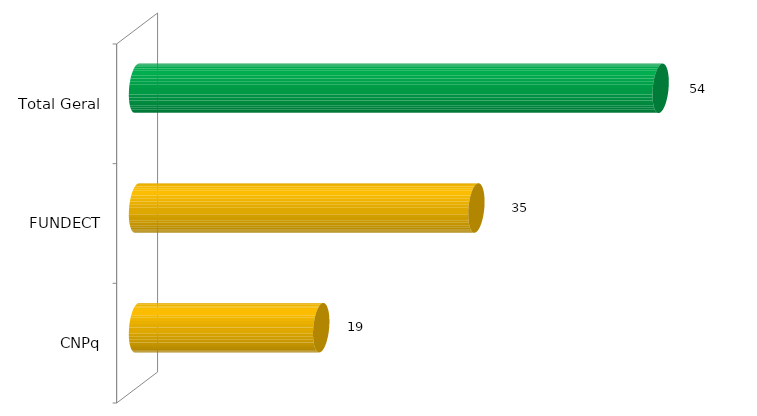
| Category | Total* |
|---|---|
| 0 | 19 |
| 1 | 35 |
| 2 | 54 |